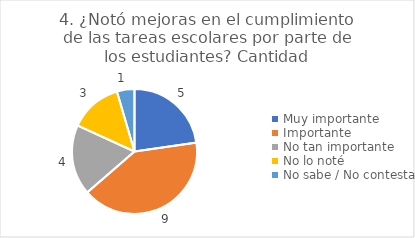
| Category | 4. ¿Notó mejoras en el cumplimiento de las tareas escolares por parte de los estudiantes? |
|---|---|
| Muy importante  | 0.227 |
| Importante  | 0.409 |
| No tan importante  | 0.182 |
| No lo noté  | 0.136 |
| No sabe / No contesta | 0.045 |